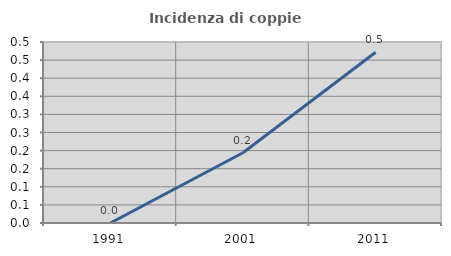
| Category | Incidenza di coppie miste |
|---|---|
| 1991.0 | 0 |
| 2001.0 | 0.194 |
| 2011.0 | 0.472 |